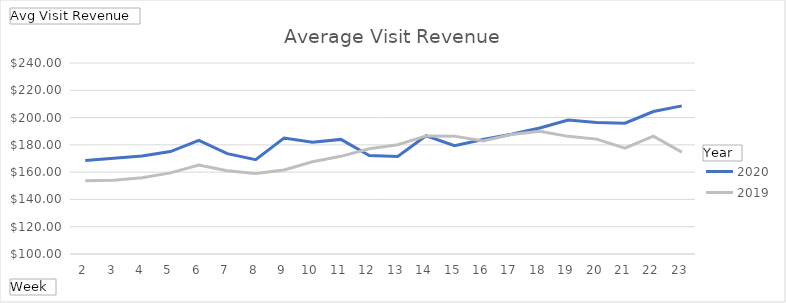
| Category | 2020 | 2019 |
|---|---|---|
| 2 | 168.559 | 153.699 |
| 3 | 170.131 | 154.128 |
| 4 | 171.815 | 155.957 |
| 5 | 175.071 | 159.451 |
| 6 | 183.258 | 165.135 |
| 7 | 173.53 | 161.055 |
| 8 | 169.184 | 159.024 |
| 9 | 185.041 | 161.552 |
| 10 | 181.915 | 167.615 |
| 11 | 183.999 | 171.595 |
| 12 | 172.123 | 177.176 |
| 13 | 171.548 | 180.106 |
| 14 | 186.661 | 186.543 |
| 15 | 179.399 | 186.398 |
| 16 | 183.981 | 182.841 |
| 17 | 187.772 | 187.589 |
| 18 | 192.352 | 189.967 |
| 19 | 198.187 | 186.223 |
| 20 | 196.315 | 184.201 |
| 21 | 195.898 | 177.652 |
| 22 | 204.457 | 186.425 |
| 23 | 208.577 | 174.672 |